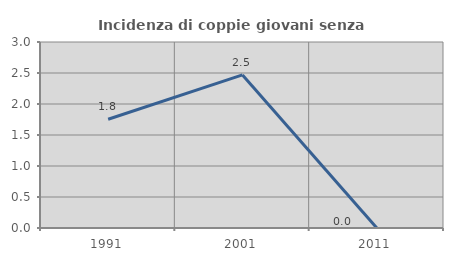
| Category | Incidenza di coppie giovani senza figli |
|---|---|
| 1991.0 | 1.754 |
| 2001.0 | 2.469 |
| 2011.0 | 0 |